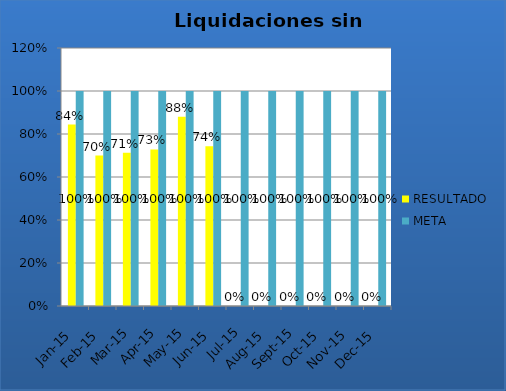
| Category | RESULTADO | META |
|---|---|---|
| ene-15 | 0.844 | 1 |
| feb-15 | 0.7 | 1 |
| mar-15 | 0.713 | 1 |
| abr-15 | 0.728 | 1 |
| may-15 | 0.88 | 1 |
| jun-15 | 0.743 | 1 |
| jul-15 | 0 | 1 |
| ago-15 | 0 | 1 |
| sep-15 | 0 | 1 |
| oct-15 | 0 | 1 |
| nov-15 | 0 | 1 |
| dic-15 | 0 | 1 |